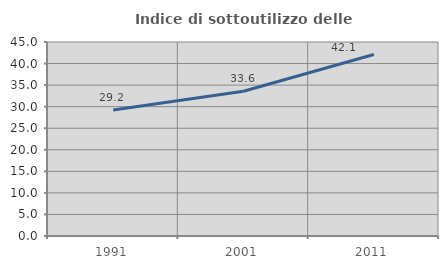
| Category | Indice di sottoutilizzo delle abitazioni  |
|---|---|
| 1991.0 | 29.204 |
| 2001.0 | 33.564 |
| 2011.0 | 42.088 |